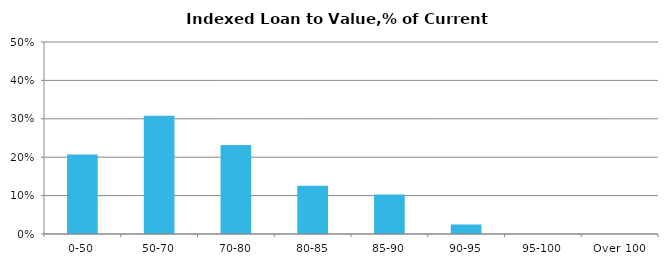
| Category | Series 0 |
|---|---|
| 0-50 | 0.207 |
| 50-70 | 0.308 |
| 70-80 | 0.232 |
| 80-85 | 0.126 |
| 85-90 | 0.103 |
| 90-95 | 0.025 |
| 95-100 | 0 |
| Over 100 | 0 |